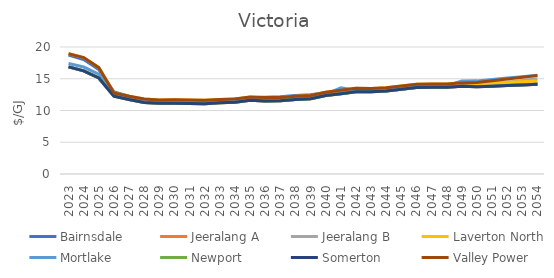
| Category | Bairnsdale | Jeeralang A | Jeeralang B | Laverton North | Mortlake | Newport | Somerton | Valley Power |
|---|---|---|---|---|---|---|---|---|
| 2023.0 | 18.735 | 16.863 | 16.863 | 18.929 | 17.393 | 16.863 | 16.863 | 18.929 |
| 2024.0 | 18.026 | 16.238 | 16.238 | 18.334 | 16.844 | 16.238 | 16.238 | 18.334 |
| 2025.0 | 16.445 | 15.129 | 15.129 | 16.745 | 15.722 | 15.129 | 15.129 | 16.745 |
| 2026.0 | 12.942 | 12.264 | 12.264 | 12.764 | 12.677 | 12.264 | 12.264 | 12.764 |
| 2027.0 | 12.257 | 11.723 | 11.723 | 12.248 | 12.168 | 11.723 | 11.723 | 12.248 |
| 2028.0 | 11.521 | 11.276 | 11.276 | 11.801 | 11.717 | 11.276 | 11.276 | 11.801 |
| 2029.0 | 11.418 | 11.148 | 11.148 | 11.673 | 11.579 | 11.148 | 11.148 | 11.673 |
| 2030.0 | 11.412 | 11.156 | 11.156 | 11.681 | 11.448 | 11.156 | 11.156 | 11.681 |
| 2031.0 | 11.355 | 11.122 | 11.122 | 11.647 | 11.396 | 11.122 | 11.122 | 11.647 |
| 2032.0 | 11.446 | 11.074 | 11.074 | 11.599 | 11.303 | 11.074 | 11.074 | 11.599 |
| 2033.0 | 11.654 | 11.217 | 11.217 | 11.742 | 11.437 | 11.217 | 11.217 | 11.742 |
| 2034.0 | 11.81 | 11.294 | 11.294 | 11.819 | 11.512 | 11.294 | 11.294 | 11.819 |
| 2035.0 | 12.02 | 11.603 | 11.603 | 12.128 | 11.818 | 11.603 | 11.603 | 12.128 |
| 2036.0 | 12.099 | 11.503 | 11.503 | 12.028 | 11.716 | 11.503 | 11.503 | 12.028 |
| 2037.0 | 12.151 | 11.519 | 11.519 | 12.044 | 11.73 | 11.519 | 11.519 | 12.044 |
| 2038.0 | 12.382 | 11.722 | 11.722 | 12.247 | 11.932 | 11.722 | 11.722 | 12.247 |
| 2039.0 | 12.496 | 11.838 | 11.838 | 12.363 | 12.045 | 11.838 | 11.838 | 12.363 |
| 2040.0 | 12.801 | 12.348 | 12.348 | 12.873 | 12.553 | 12.348 | 12.348 | 12.873 |
| 2041.0 | 13.004 | 12.649 | 12.649 | 13.174 | 13.566 | 12.649 | 12.649 | 13.174 |
| 2042.0 | 13.104 | 12.964 | 12.964 | 13.489 | 13.197 | 12.964 | 12.964 | 13.489 |
| 2043.0 | 13.037 | 12.934 | 12.934 | 13.447 | 13.161 | 12.934 | 12.934 | 13.447 |
| 2044.0 | 13.169 | 13.066 | 13.066 | 13.579 | 13.29 | 13.066 | 13.066 | 13.579 |
| 2045.0 | 13.461 | 13.358 | 13.358 | 13.871 | 13.612 | 13.358 | 13.358 | 13.871 |
| 2046.0 | 13.715 | 13.612 | 13.612 | 14.125 | 13.864 | 13.612 | 13.612 | 14.125 |
| 2047.0 | 13.772 | 13.669 | 13.669 | 14.182 | 13.912 | 13.669 | 13.669 | 14.182 |
| 2048.0 | 13.749 | 13.646 | 13.646 | 14.159 | 13.918 | 13.646 | 13.646 | 14.159 |
| 2049.0 | 13.94 | 13.838 | 13.838 | 14.35 | 14.664 | 13.838 | 13.838 | 14.35 |
| 2050.0 | 13.833 | 13.732 | 13.899 | 14.237 | 14.666 | 13.732 | 13.732 | 14.403 |
| 2051.0 | 13.93 | 13.829 | 14.167 | 14.334 | 14.886 | 13.829 | 13.829 | 14.671 |
| 2052.0 | 14.028 | 13.927 | 14.441 | 14.432 | 15.109 | 13.927 | 13.927 | 14.944 |
| 2053.0 | 14.126 | 14.026 | 14.719 | 14.53 | 15.336 | 14.026 | 14.026 | 15.222 |
| 2054.0 | 14.226 | 14.125 | 15.004 | 14.629 | 15.566 | 14.125 | 14.125 | 15.505 |